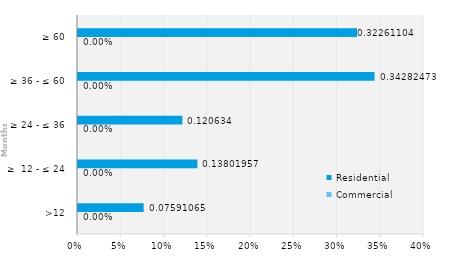
| Category | Commercial | Residential |
|---|---|---|
| >12 | 0 | 0.076 |
| ≥  12 - ≤ 24 | 0 | 0.138 |
| ≥ 24 - ≤ 36 | 0 | 0.121 |
| ≥ 36 - ≤ 60 | 0 | 0.343 |
| ≥ 60 | 0 | 0.323 |